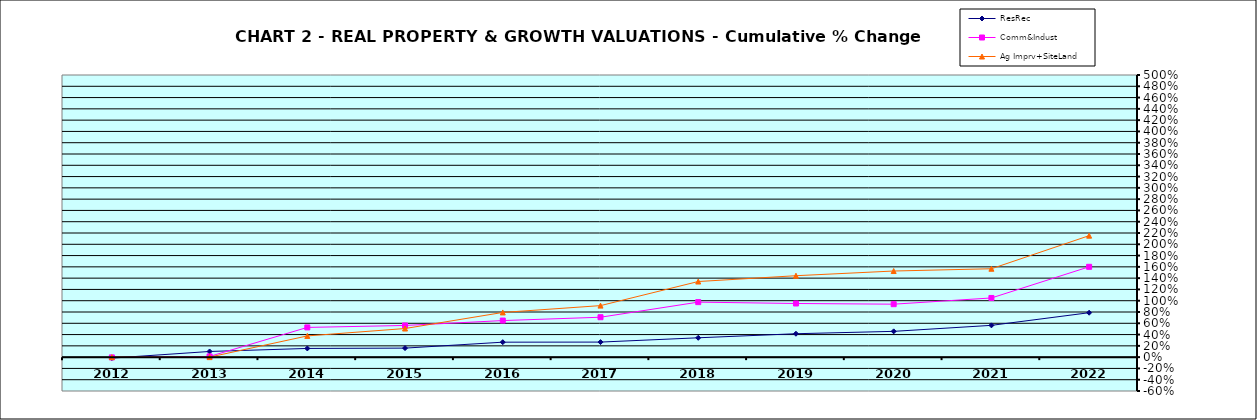
| Category | ResRec | Comm&Indust | Ag Imprv+SiteLand |
|---|---|---|---|
| 2012.0 | -0.017 | -0.004 | 0 |
| 2013.0 | 0.101 | 0.013 | 0.001 |
| 2014.0 | 0.154 | 0.527 | 0.376 |
| 2015.0 | 0.16 | 0.561 | 0.507 |
| 2016.0 | 0.265 | 0.648 | 0.792 |
| 2017.0 | 0.267 | 0.707 | 0.913 |
| 2018.0 | 0.343 | 0.975 | 1.34 |
| 2019.0 | 0.415 | 0.951 | 1.443 |
| 2020.0 | 0.457 | 0.939 | 1.526 |
| 2021.0 | 0.563 | 1.049 | 1.567 |
| 2022.0 | 0.788 | 1.601 | 2.153 |